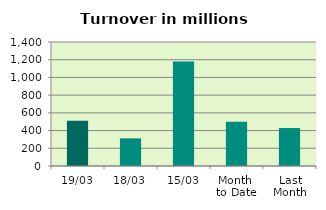
| Category | Series 0 |
|---|---|
| 19/03 | 510.959 |
| 18/03 | 312.099 |
| 15/03 | 1179.268 |
| Month 
to Date | 499.693 |
| Last
Month | 428.598 |